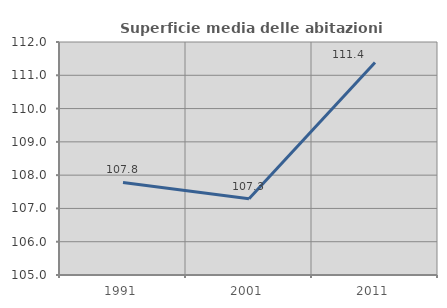
| Category | Superficie media delle abitazioni occupate |
|---|---|
| 1991.0 | 107.781 |
| 2001.0 | 107.289 |
| 2011.0 | 111.387 |